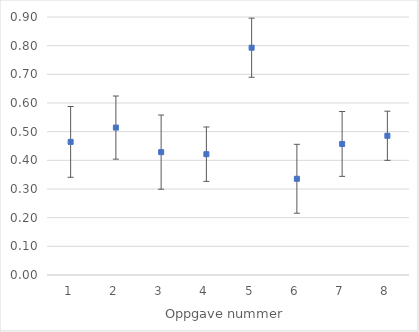
| Category | Series 0 |
|---|---|
| 0 | 0.464 |
| 1 | 0.514 |
| 2 | 0.429 |
| 3 | 0.421 |
| 4 | 0.793 |
| 5 | 0.336 |
| 6 | 0.457 |
| 7 | 0.486 |